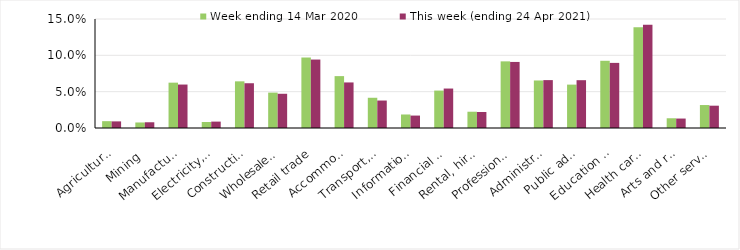
| Category | Week ending 14 Mar 2020 | This week (ending 24 Apr 2021) |
|---|---|---|
| Agriculture, forestry and fishing | 0.009 | 0.009 |
| Mining | 0.008 | 0.008 |
| Manufacturing | 0.062 | 0.06 |
| Electricity, gas, water and waste services | 0.008 | 0.009 |
| Construction | 0.064 | 0.062 |
| Wholesale trade | 0.049 | 0.047 |
| Retail trade | 0.097 | 0.094 |
| Accommodation and food services | 0.071 | 0.063 |
| Transport, postal and warehousing | 0.042 | 0.038 |
| Information media and telecommunications | 0.019 | 0.017 |
| Financial and insurance services | 0.052 | 0.054 |
| Rental, hiring and real estate services | 0.022 | 0.022 |
| Professional, scientific and technical services | 0.092 | 0.091 |
| Administrative and support services | 0.065 | 0.066 |
| Public administration and safety | 0.06 | 0.066 |
| Education and training | 0.092 | 0.09 |
| Health care and social assistance | 0.139 | 0.142 |
| Arts and recreation services | 0.013 | 0.013 |
| Other services | 0.032 | 0.031 |